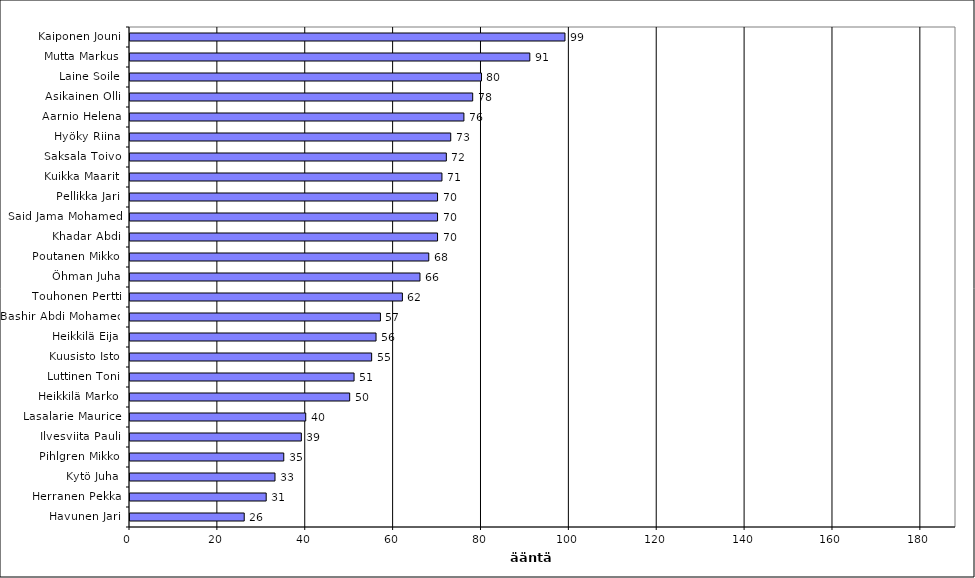
| Category | Series 0 |
|---|---|
| Kaiponen Jouni | 99 |
| Mutta Markus | 91 |
| Laine Soile | 80 |
| Asikainen Olli | 78 |
| Aarnio Helena | 76 |
| Hyöky Riina | 73 |
| Saksala Toivo | 72 |
| Kuikka Maarit | 71 |
| Pellikka Jari | 70 |
| Said Jama Mohamed | 70 |
| Khadar Abdi | 70 |
| Poutanen Mikko | 68 |
| Öhman Juha | 66 |
| Touhonen Pertti | 62 |
| Bashir Abdi Mohamed | 57 |
| Heikkilä Eija | 56 |
| Kuusisto Isto | 55 |
| Luttinen Toni | 51 |
| Heikkilä Marko | 50 |
| Lasalarie Maurice | 40 |
| Ilvesviita Pauli | 39 |
| Pihlgren Mikko | 35 |
| Kytö Juha | 33 |
| Herranen Pekka | 31 |
| Havunen Jari | 26 |